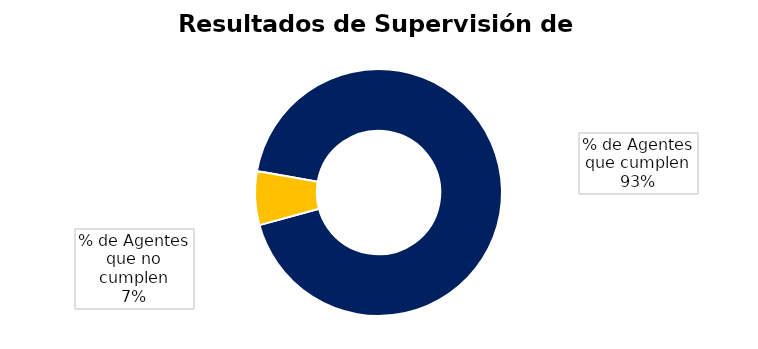
| Category | Cuenta de Departamento |
|---|---|
| % de Agentes que cumplen | 119 |
| % de Agentes que no cumplen | 9 |